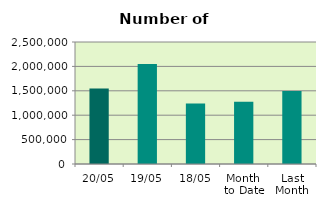
| Category | Series 0 |
|---|---|
| 20/05 | 1545342 |
| 19/05 | 2050238 |
| 18/05 | 1239482 |
| Month 
to Date | 1275691.538 |
| Last
Month | 1493476.8 |